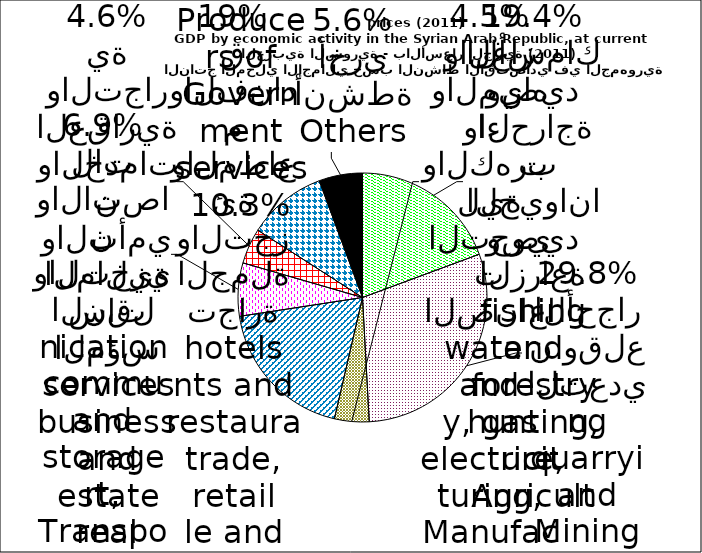
| Category | Series 0 |
|---|---|
| Agriculture, hunting, forestry and fishing | 668659 |
| Mining and quarrying | 1029038 |
| Manufacturing, electricity, gas and water | 155156 |
| Wholesale and retail trade, restaurants and hotels | 654911 |
| Transport, storage and communication | 238614 |
| Financial institutions, insurance,real estate and business services | 159177 |
| Producers of government services | 354637 |
| Others | 195031 |